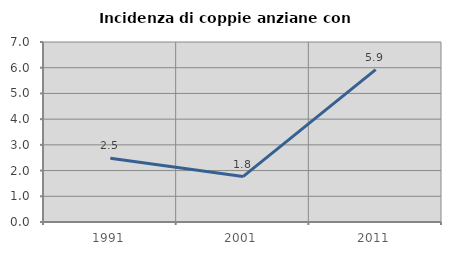
| Category | Incidenza di coppie anziane con figli |
|---|---|
| 1991.0 | 2.479 |
| 2001.0 | 1.767 |
| 2011.0 | 5.923 |